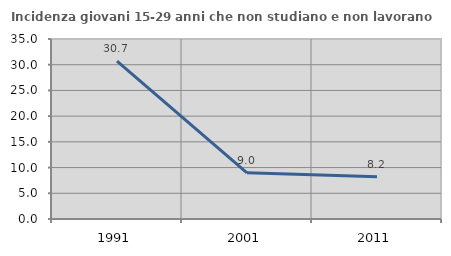
| Category | Incidenza giovani 15-29 anni che non studiano e non lavorano  |
|---|---|
| 1991.0 | 30.693 |
| 2001.0 | 8.979 |
| 2011.0 | 8.239 |